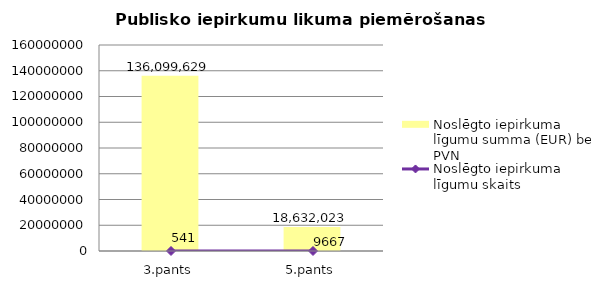
| Category | Noslēgto iepirkuma līgumu summa (EUR) bez PVN |
|---|---|
| 3.pants | 136099629 |
| 5.pants | 18632023 |